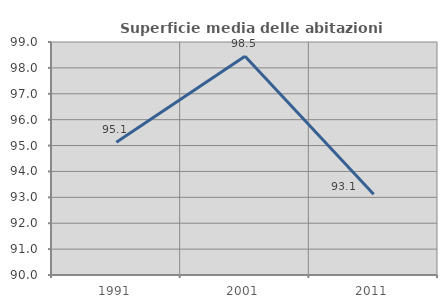
| Category | Superficie media delle abitazioni occupate |
|---|---|
| 1991.0 | 95.126 |
| 2001.0 | 98.452 |
| 2011.0 | 93.12 |